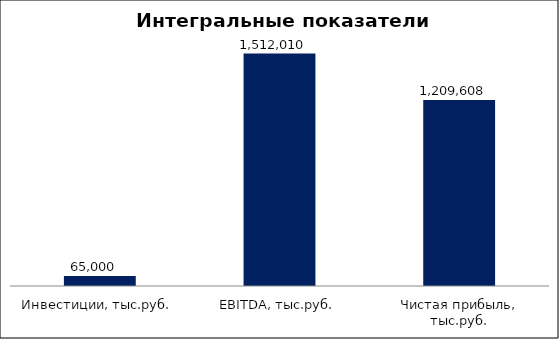
| Category | Series 0 |
|---|---|
| Инвестиции, тыс.руб. | 65000 |
| EBITDА, тыс.руб. | 1512010 |
| Чистая прибыль, тыс.руб. | 1209608 |